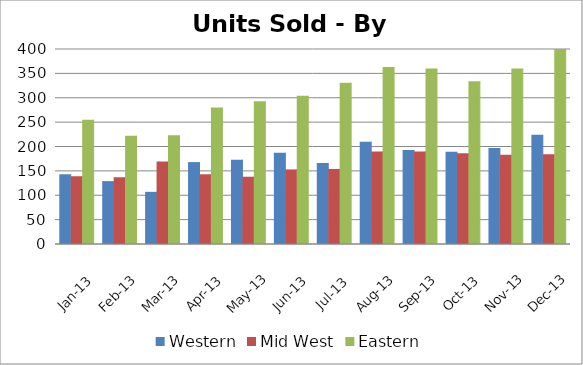
| Category | Western | Mid West | Eastern |
|---|---|---|---|
| 2013-01-31 | 143 | 139 | 255 |
| 2013-02-28 | 129 | 137 | 222 |
| 2013-03-31 | 107 | 169 | 223 |
| 2013-04-30 | 168 | 143 | 280 |
| 2013-05-31 | 173 | 138 | 293 |
| 2013-06-30 | 187 | 153 | 304 |
| 2013-07-31 | 166 | 154 | 331 |
| 2013-08-31 | 210 | 190 | 363 |
| 2013-09-30 | 193 | 190 | 360 |
| 2013-10-31 | 189 | 186 | 334 |
| 2013-11-30 | 197 | 183 | 360 |
| 2013-12-31 | 224 | 184 | 400 |